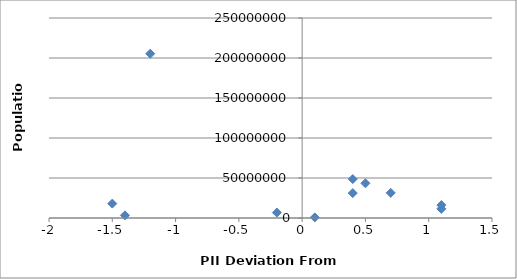
| Category | Population |
|---|---|
| 0.5 | 43417000 |
| 1.1000000000000005 | 11410651 |
| -1.1999999999999993 | 205338000 |
| -1.5 | 18006407 |
| 0.40000000000000036 | 48663285 |
| 1.1000000000000005 | 16144000 |
| 0.10000000000000053 | 735554 |
| -0.1999999999999993 | 6783272 |
| 0.40000000000000036 | 31151643 |
| -1.3999999999999995 | 3324460 |
| 0.7000000000000002 | 31416000 |